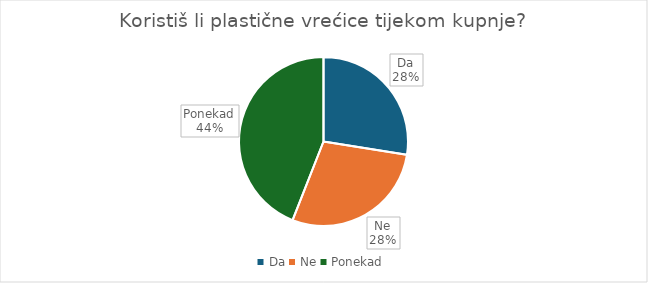
| Category | Series 0 |
|---|---|
| Da | 30 |
| Ne | 31 |
| Ponekad | 48 |